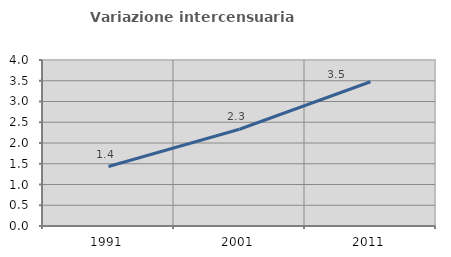
| Category | Variazione intercensuaria annua |
|---|---|
| 1991.0 | 1.433 |
| 2001.0 | 2.332 |
| 2011.0 | 3.476 |